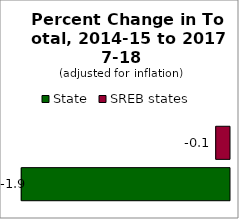
| Category | State | SREB states |
|---|---|---|
| 0 | -1.902 | -0.126 |